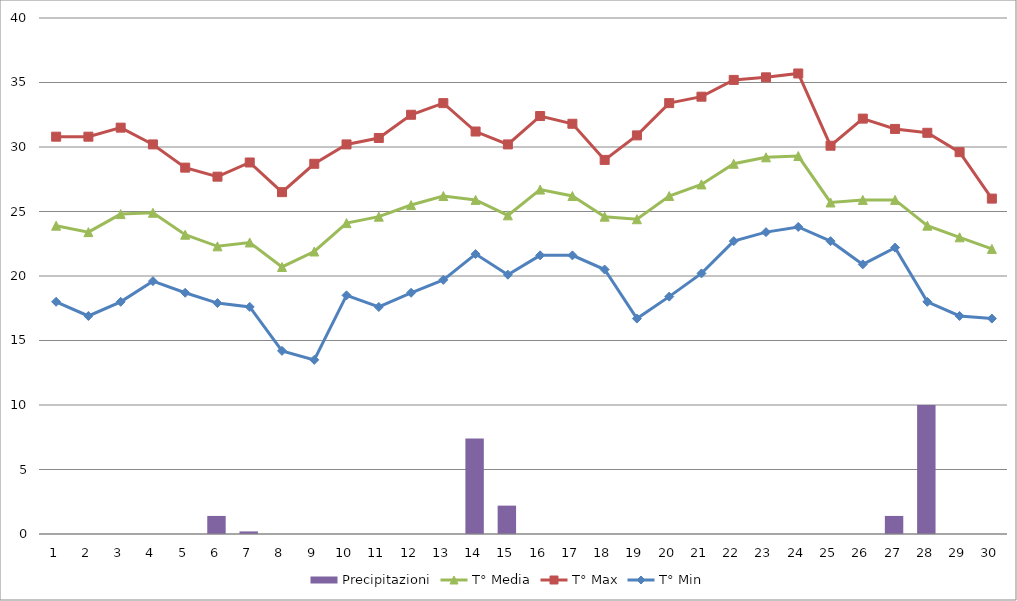
| Category | Precipitazioni |
|---|---|
| 0 | 0 |
| 1 | 0 |
| 2 | 0 |
| 3 | 0 |
| 4 | 0 |
| 5 | 1.4 |
| 6 | 0.2 |
| 7 | 0 |
| 8 | 0 |
| 9 | 0 |
| 10 | 0 |
| 11 | 0 |
| 12 | 0 |
| 13 | 7.4 |
| 14 | 2.2 |
| 15 | 0 |
| 16 | 0 |
| 17 | 0 |
| 18 | 0 |
| 19 | 0 |
| 20 | 0 |
| 21 | 0 |
| 22 | 0 |
| 23 | 0 |
| 24 | 0 |
| 25 | 0 |
| 26 | 1.4 |
| 27 | 10 |
| 28 | 0 |
| 29 | 0 |